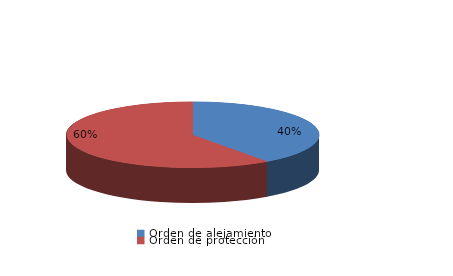
| Category | Series 0 |
|---|---|
| Orden de alejamiento | 2 |
| Orden de protección | 3 |